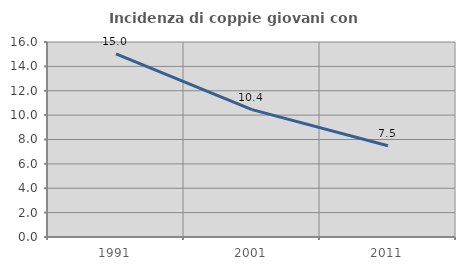
| Category | Incidenza di coppie giovani con figli |
|---|---|
| 1991.0 | 15.034 |
| 2001.0 | 10.448 |
| 2011.0 | 7.487 |